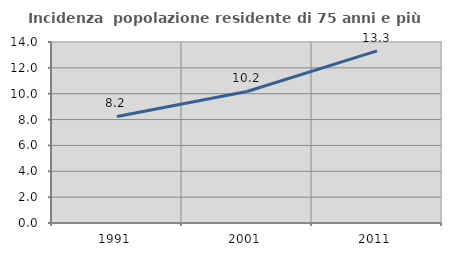
| Category | Incidenza  popolazione residente di 75 anni e più |
|---|---|
| 1991.0 | 8.24 |
| 2001.0 | 10.173 |
| 2011.0 | 13.318 |